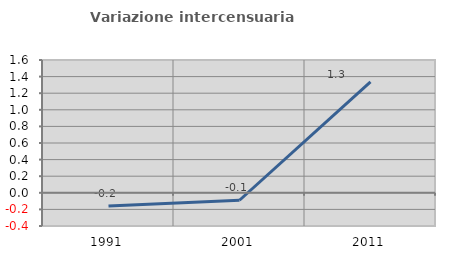
| Category | Variazione intercensuaria annua |
|---|---|
| 1991.0 | -0.16 |
| 2001.0 | -0.09 |
| 2011.0 | 1.336 |